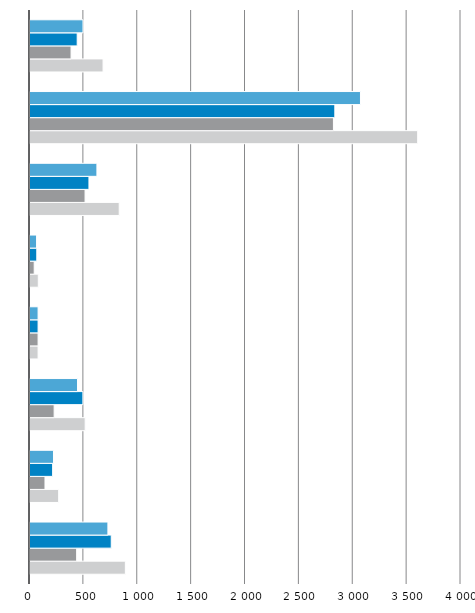
| Category | Summe von Maximum | Summe von Minimum | Summe von € je EW | Summe von Deutschland |
|---|---|---|---|---|
| Private Haushalte u. private Organisationen ohne Erwerbszweck | 885 | 433 | 754 | 723 |
| Arbeitgeber | 266 | 139 | 210 | 218 |
| Private Krankenversicherung | 512 | 224 | 491 | 441 |
| Gesetzliche Unfallversicherung | 75 | 75 | 75 | 75 |
| Gesetzliche Rentenversicherung | 77 | 39 | 63 | 61 |
| Soziale Pflegeversicherung | 828 | 511 | 547 | 621 |
| Gesetzliche Krankenversicherung | 3598 | 2816 | 2829 | 3067 |
| Öffentlliche Haushalte | 678 | 381 | 438 | 492 |